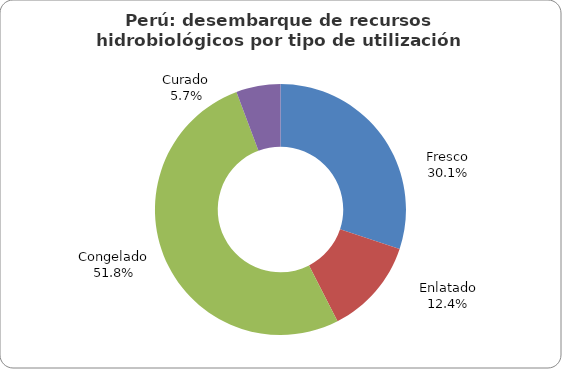
| Category | Series 0 |
|---|---|
| Fresco | 390828.605 |
| Enlatado | 160881.881 |
| Congelado | 672563.085 |
| Curado | 74096.316 |